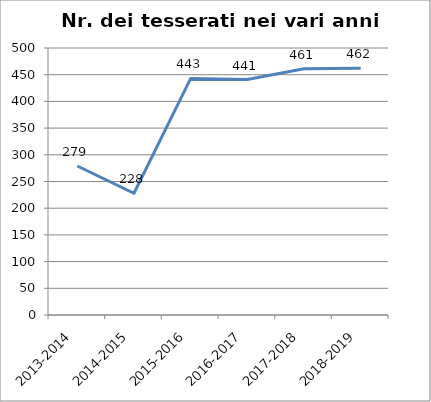
| Category | Nr. Tesserati |
|---|---|
| 2013-2014 | 279 |
| 2014-2015 | 228 |
| 2015-2016 | 443 |
| 2016-2017 | 441 |
| 2017-2018 | 461 |
| 2018-2019 | 462 |